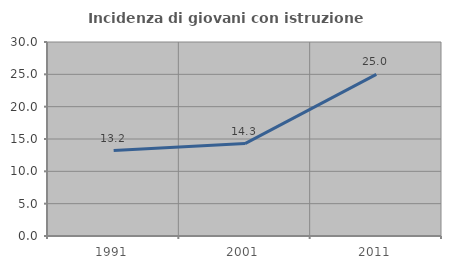
| Category | Incidenza di giovani con istruzione universitaria |
|---|---|
| 1991.0 | 13.208 |
| 2001.0 | 14.286 |
| 2011.0 | 25 |